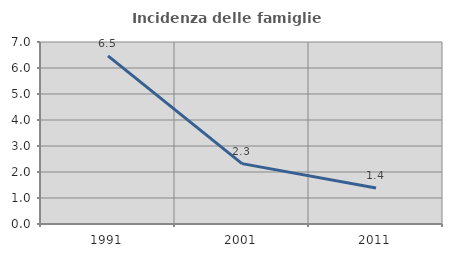
| Category | Incidenza delle famiglie numerose |
|---|---|
| 1991.0 | 6.469 |
| 2001.0 | 2.323 |
| 2011.0 | 1.383 |